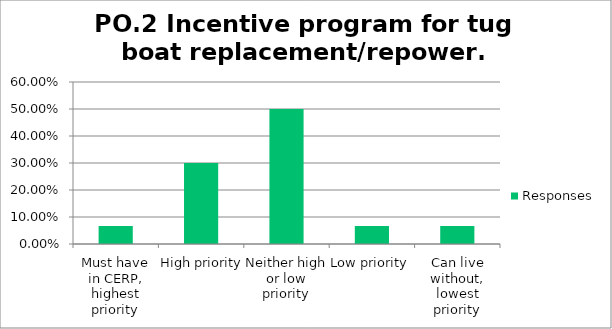
| Category | Responses |
|---|---|
| Must have in CERP, highest priority | 0.067 |
| High priority | 0.3 |
| Neither high or low priority | 0.5 |
| Low priority | 0.067 |
| Can live without, lowest priority | 0.067 |